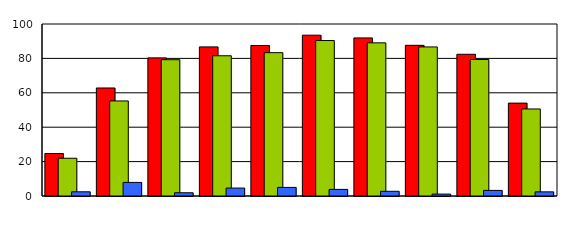
| Category | Series 0 | Series 1 | Series 2 |
|---|---|---|---|
| 0 | 24.7 | 21.951 | 2.439 |
| 1 | 62.8 | 55.263 | 7.895 |
| 2 | 80.3 | 79.245 | 1.887 |
| 3 | 86.7 | 81.538 | 4.615 |
| 4 | 87.5 | 83.333 | 5 |
| 5 | 93.5 | 90.385 | 3.846 |
| 6 | 91.9 | 89.041 | 2.74 |
| 7 | 87.6 | 86.667 | 1.111 |
| 8 | 82.4 | 79.348 | 3.261 |
| 9 | 54 | 50.602 | 2.41 |